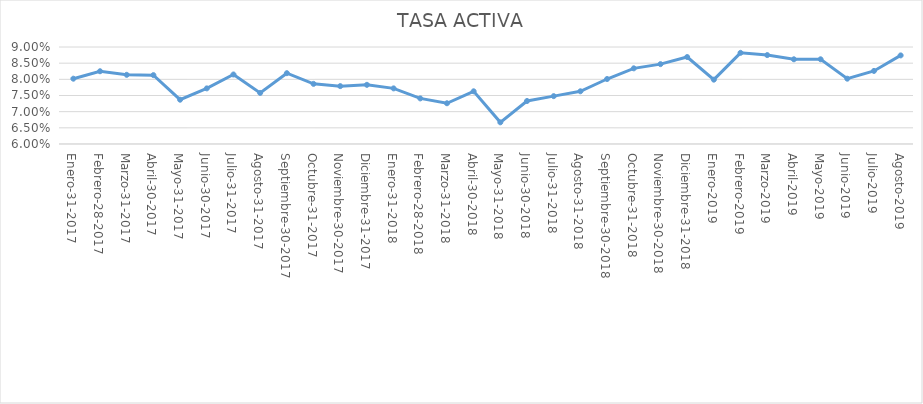
| Category | Valor |
|---|---|
| Enero-31-2017 | 0.08 |
| Febrero-28-2017 | 0.082 |
| Marzo-31-2017 | 0.081 |
| Abril-30-2017 | 0.081 |
| Mayo-31-2017 | 0.074 |
| Junio-30-2017 | 0.077 |
| Julio-31-2017 | 0.082 |
| Agosto-31-2017 | 0.076 |
| Septiembre-30-2017 | 0.082 |
| Octubre-31-2017 | 0.079 |
| Noviembre-30-2017 | 0.078 |
| Diciembre-31-2017 | 0.078 |
| Enero-31-2018 | 0.077 |
| Febrero-28-2018 | 0.074 |
| Marzo-31-2018 | 0.073 |
| Abril-30-2018 | 0.076 |
| Mayo-31-2018 | 0.067 |
| Junio-30-2018 | 0.073 |
| Julio-31-2018 | 0.075 |
| Agosto-31-2018 | 0.076 |
| Septiembre-30-2018 | 0.08 |
| Octubre-31-2018 | 0.083 |
| Noviembre-30-2018 | 0.085 |
| Diciembre-31-2018 | 0.087 |
| Enero-2019 | 0.08 |
| Febrero-2019 | 0.088 |
| Marzo-2019 | 0.088 |
| Abril-2019 | 0.086 |
| Mayo-2019 | 0.086 |
| Junio-2019 | 0.08 |
| Julio-2019 | 0.083 |
| Agosto-2019 | 0.087 |